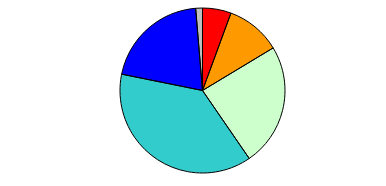
| Category | Series 0 |
|---|---|
| 0 | 38 |
| 1 | 73 |
| 2 | 163 |
| 3 | 256 |
| 4 | 139 |
| 5 | 9 |